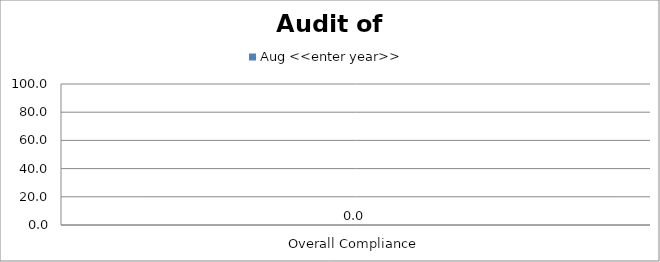
| Category | Aug <<enter year>> |
|---|---|
| Overall Compliance | 0 |